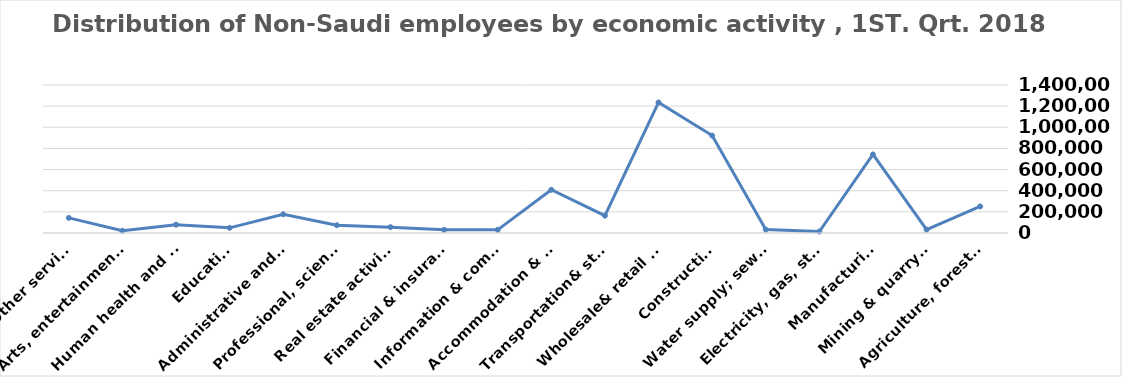
| Category | Series 0 |
|---|---|
| Agriculture, forestry & fishing | 251345 |
| Mining & quarrying | 32201 |
| Manufacturing | 743219 |
| Electricity, gas, steam & air conditioning supply | 14362 |
| Water supply; sewerage, waste remediation  | 32174 |
| Construction | 922018 |
| Wholesale& retail trade; repair of motor vehicles | 1235027 |
| Transportation& storage | 164032 |
| Accommodation & food service activities | 408909 |
| Information & communication | 29818 |
| Financial & insurance | 30453 |
| Real estate activities | 55361 |
| Professional, scientific & technical activities | 73449 |
| Administrative and support service activities | 177214 |
| Education | 48801 |
| Human health and &l work activities | 78768 |
| Arts, entertainment & recreation | 20931 |
| Other service | 142901 |